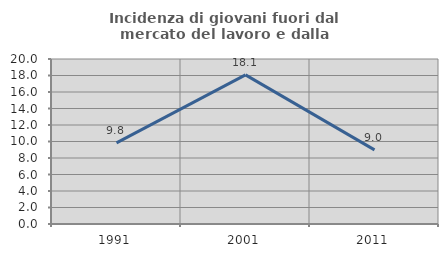
| Category | Incidenza di giovani fuori dal mercato del lavoro e dalla formazione  |
|---|---|
| 1991.0 | 9.829 |
| 2001.0 | 18.072 |
| 2011.0 | 8.982 |